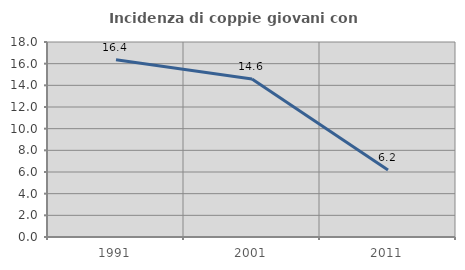
| Category | Incidenza di coppie giovani con figli |
|---|---|
| 1991.0 | 16.358 |
| 2001.0 | 14.595 |
| 2011.0 | 6.174 |